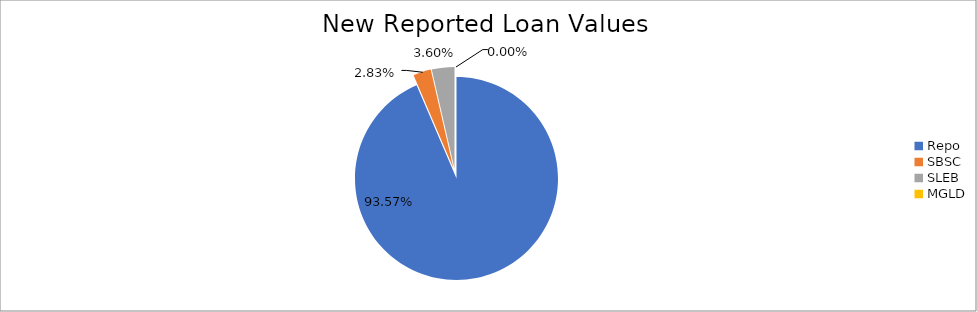
| Category | Series 0 |
|---|---|
| Repo | 9434602.331 |
| SBSC | 285467.971 |
| SLEB | 362926.023 |
| MGLD | 60.403 |